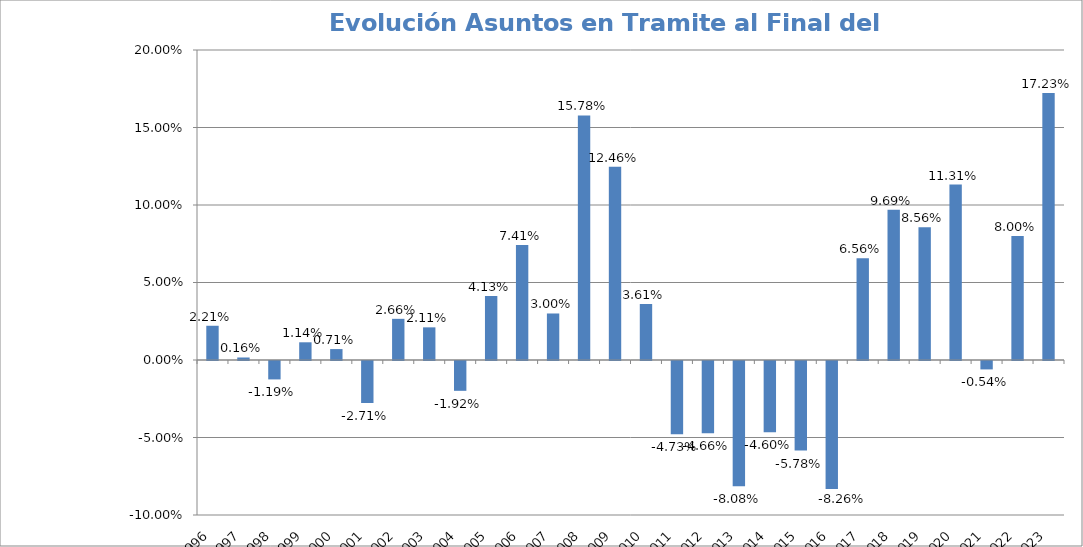
| Category | Evolución |
|---|---|
| 1996.0 | 0.022 |
| 1997.0 | 0.002 |
| 1998.0 | -0.012 |
| 1999.0 | 0.011 |
| 2000.0 | 0.007 |
| 2001.0 | -0.027 |
| 2002.0 | 0.027 |
| 2003.0 | 0.021 |
| 2004.0 | -0.019 |
| 2005.0 | 0.041 |
| 2006.0 | 0.074 |
| 2007.0 | 0.03 |
| 2008.0 | 0.158 |
| 2009.0 | 0.125 |
| 2010.0 | 0.036 |
| 2011.0 | -0.047 |
| 2012.0 | -0.047 |
| 2013.0 | -0.081 |
| 2014.0 | -0.046 |
| 2015.0 | -0.058 |
| 2016.0 | -0.083 |
| 2017.0 | 0.066 |
| 2018.0 | 0.097 |
| 2019.0 | 0.086 |
| 2020.0 | 0.113 |
| 2021.0 | -0.005 |
| 2022.0 | 0.08 |
| 2023.0 | 0.172 |